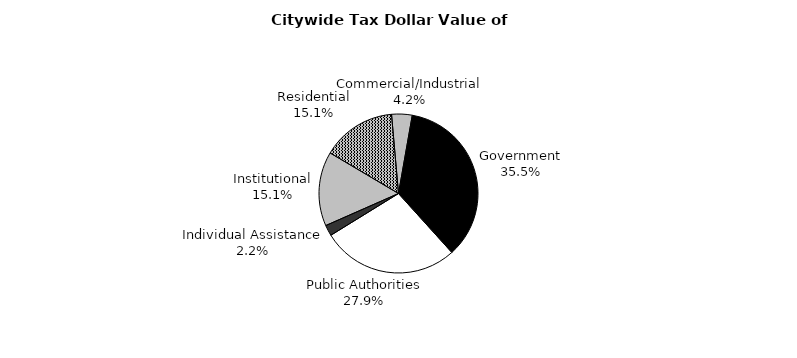
| Category | Series 0 |
|---|---|
| Government | 5999924563 |
| Public Authorities | 4713091925 |
| Individual Assistance | 370999714 |
| Institutional | 2555277426 |
| Residential | 2547573964 |
| Commercial/Industrial | 705525616 |